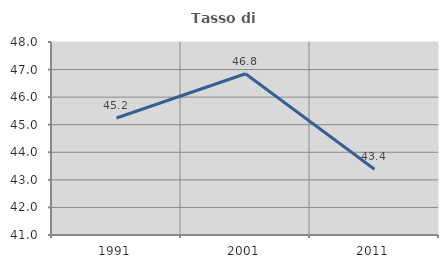
| Category | Tasso di occupazione   |
|---|---|
| 1991.0 | 45.245 |
| 2001.0 | 46.849 |
| 2011.0 | 43.386 |